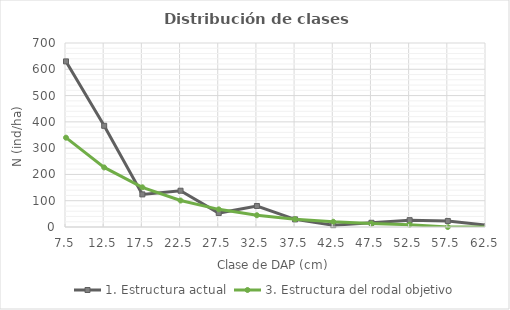
| Category | 1. Estructura actual | 3. Estructura del rodal objetivo |
|---|---|---|
| 7.5 | 630 | 339.86 |
| 12.5 | 385 | 226.573 |
| 17.5 | 124 | 151.049 |
| 22.5 | 138 | 100.699 |
| 27.5 | 53 | 67.133 |
| 32.5 | 80 | 44.755 |
| 37.5 | 29 | 29.837 |
| 42.5 | 7 | 19.891 |
| 47.5 | 16 | 13.261 |
| 52.5 | 26 | 8.841 |
| 57.5 | 23 | 0 |
| 62.5 | 7 | 0 |